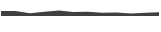
| Category | Series 0 |
|---|---|
| 0 | 0.308 |
| 1 | 0.312 |
| 2 | 0.175 |
| 3 | 0.271 |
| 4 | 0.34 |
| 5 | 0.247 |
| 6 | 0.267 |
| 7 | 0.204 |
| 8 | 0.225 |
| 9 | 0.157 |
| 10 | 0.208 |
| 11 | 0.23 |